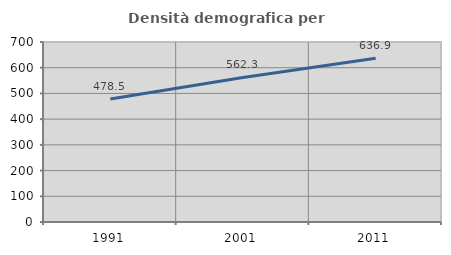
| Category | Densità demografica |
|---|---|
| 1991.0 | 478.514 |
| 2001.0 | 562.314 |
| 2011.0 | 636.925 |